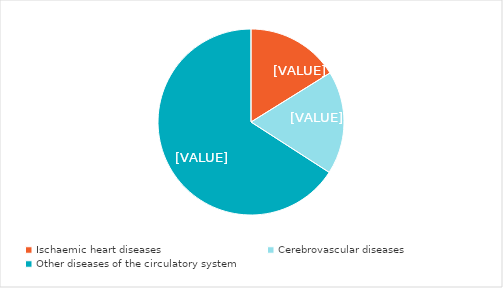
| Category | Series 0 |
|---|---|
| Ischaemic heart diseases | 16.155 |
| Cerebrovascular diseases | 17.953 |
| Other diseases of the circulatory system | 65.892 |